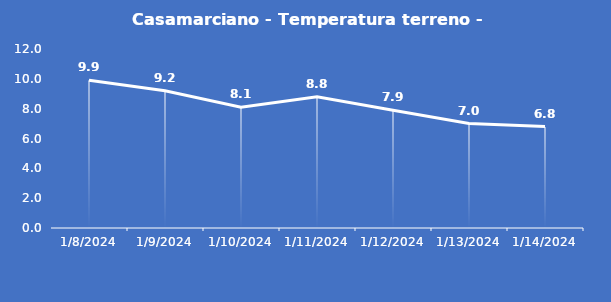
| Category | Casamarciano - Temperatura terreno - Grezzo (°C) |
|---|---|
| 1/8/24 | 9.9 |
| 1/9/24 | 9.2 |
| 1/10/24 | 8.1 |
| 1/11/24 | 8.8 |
| 1/12/24 | 7.9 |
| 1/13/24 | 7 |
| 1/14/24 | 6.8 |